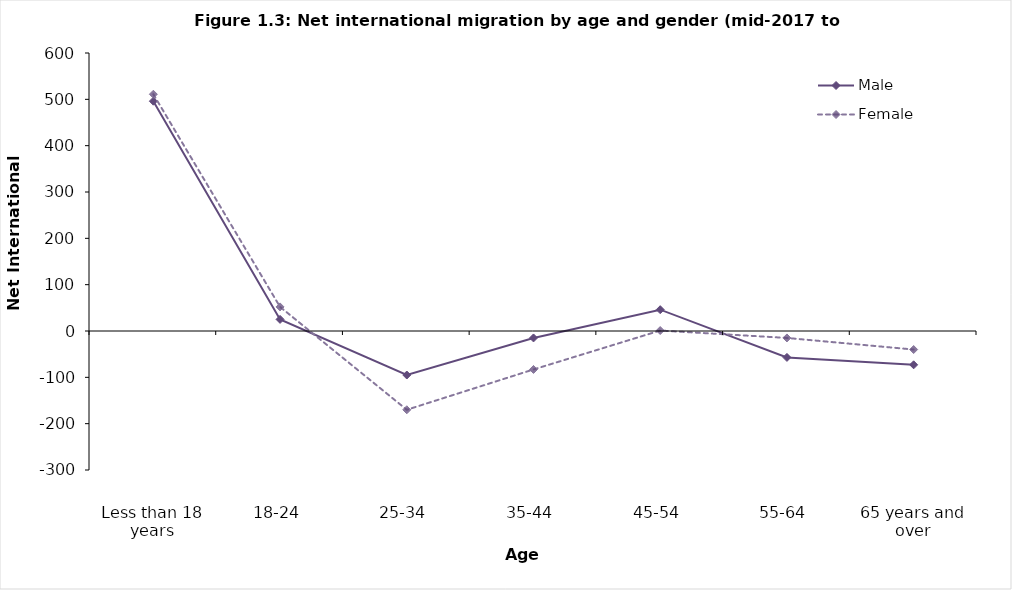
| Category | Male  | Female |
|---|---|---|
| Less than 18 years | 496 | 511 |
| 18-24 | 25 | 52 |
| 25-34 | -95 | -170 |
| 35-44 | -15 | -83 |
| 45-54 | 46 | 1 |
| 55-64 | -57 | -15 |
| 65 years and over | -73 | -40 |